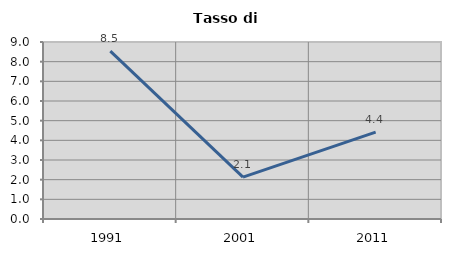
| Category | Tasso di disoccupazione   |
|---|---|
| 1991.0 | 8.532 |
| 2001.0 | 2.131 |
| 2011.0 | 4.419 |